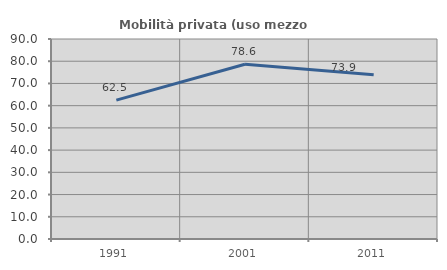
| Category | Mobilità privata (uso mezzo privato) |
|---|---|
| 1991.0 | 62.5 |
| 2001.0 | 78.626 |
| 2011.0 | 73.864 |